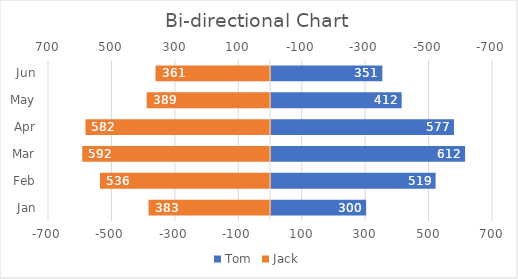
| Category | Tom |
|---|---|
| Jan | 300 |
| Feb | 519 |
| Mar | 612 |
| Apr | 577 |
| May | 412 |
| Jun | 351 |